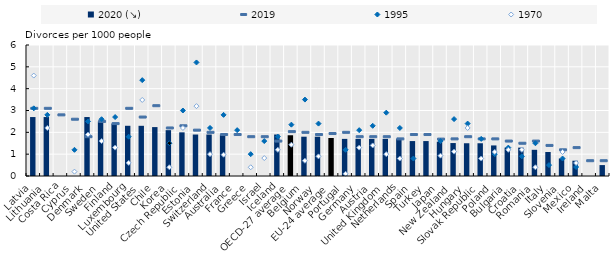
| Category | 2020 (↘) |
|---|---|
| Latvia | 2.7 |
| Lithuania | 2.7 |
| Costa Rica | 0 |
| Cyprus | 0 |
| Denmark | 2.7 |
| Sweden | 2.5 |
| Finland | 2.4 |
| Luxembourg | 2.3 |
| United States | 2.299 |
| Chile | 2.24 |
| Korea | 2.1 |
| Czech Republic | 2 |
| Estonia | 1.9 |
| Switzerland | 1.9 |
| Australia | 1.9 |
| France | 0 |
| Greece | 0 |
| Israel | 0 |
| Iceland | 1.9 |
| OECD-27 average | 1.866 |
| Belgium | 1.8 |
| Norway | 1.8 |
| EU-24 average | 1.742 |
| Portugal | 1.7 |
| Germany | 1.7 |
| Austria | 1.7 |
| United Kingdom | 1.7 |
| Netherlands | 1.7 |
| Spain | 1.6 |
| Turkey | 1.6 |
| Japan | 1.57 |
| New Zealand | 1.509 |
| Hungary | 1.5 |
| Slovak Republic | 1.5 |
| Poland | 1.4 |
| Bulgaria | 1.3 |
| Croatia | 1.3 |
| Romania | 1.2 |
| Italy | 1.1 |
| Slovenia | 0.8 |
| Mexico | 0.7 |
| Ireland | 0 |
| Malta | 0.5 |